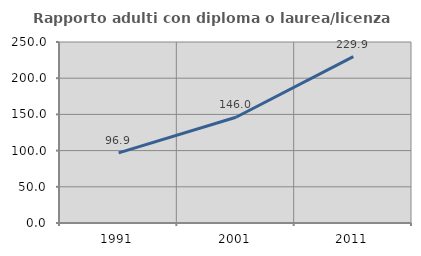
| Category | Rapporto adulti con diploma o laurea/licenza media  |
|---|---|
| 1991.0 | 96.851 |
| 2001.0 | 146.025 |
| 2011.0 | 229.892 |